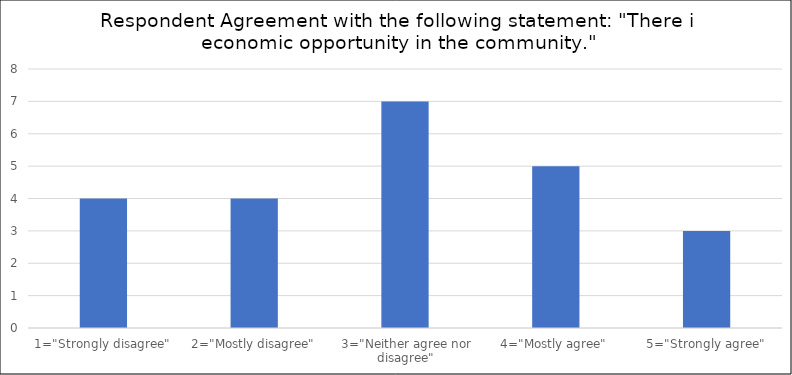
| Category | Number of Responses |
|---|---|
| 1="Strongly disagree" | 4 |
| 2="Mostly disagree" | 4 |
| 3="Neither agree nor disagree" | 7 |
| 4="Mostly agree" | 5 |
| 5="Strongly agree" | 3 |